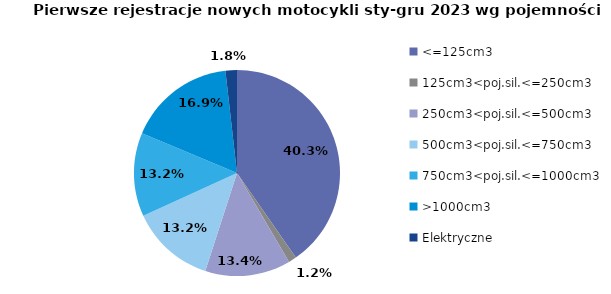
| Category | Series 0 |
|---|---|
| <=125cm3 | 11195 |
| 125cm3<poj.sil.<=250cm3 | 343 |
| 250cm3<poj.sil.<=500cm3 | 3723 |
| 500cm3<poj.sil.<=750cm3 | 3661 |
| 750cm3<poj.sil.<=1000cm3 | 3651 |
| >1000cm3 | 4684 |
| Elektryczne | 499 |